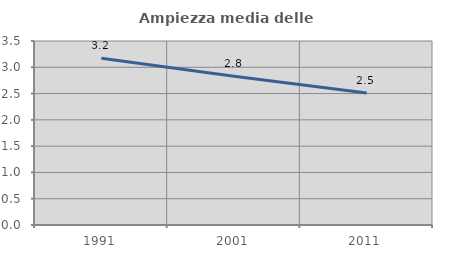
| Category | Ampiezza media delle famiglie |
|---|---|
| 1991.0 | 3.173 |
| 2001.0 | 2.829 |
| 2011.0 | 2.511 |